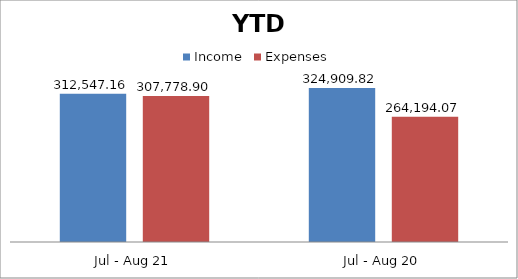
| Category | Income | Expenses |
|---|---|---|
| Jul - Aug 21 | 312547.16 | 307778.9 |
| Jul - Aug 20 | 324909.82 | 264194.07 |